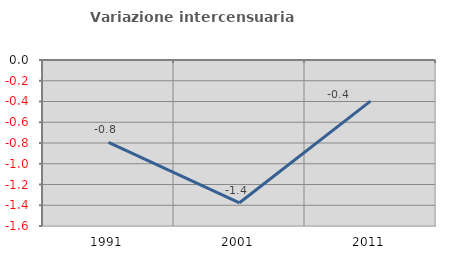
| Category | Variazione intercensuaria annua |
|---|---|
| 1991.0 | -0.793 |
| 2001.0 | -1.376 |
| 2011.0 | -0.396 |